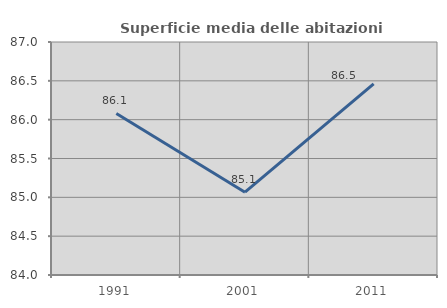
| Category | Superficie media delle abitazioni occupate |
|---|---|
| 1991.0 | 86.08 |
| 2001.0 | 85.066 |
| 2011.0 | 86.461 |